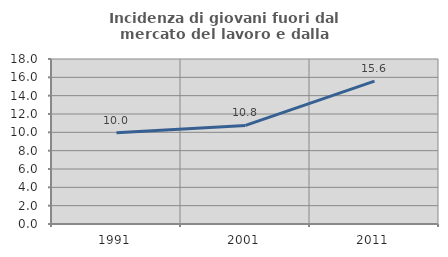
| Category | Incidenza di giovani fuori dal mercato del lavoro e dalla formazione  |
|---|---|
| 1991.0 | 9.967 |
| 2001.0 | 10.757 |
| 2011.0 | 15.591 |